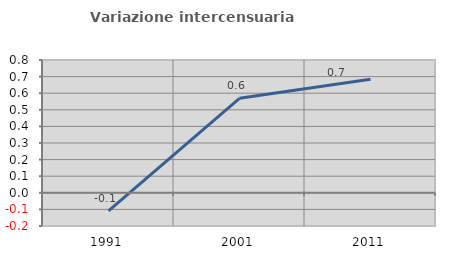
| Category | Variazione intercensuaria annua |
|---|---|
| 1991.0 | -0.11 |
| 2001.0 | 0.569 |
| 2011.0 | 0.684 |